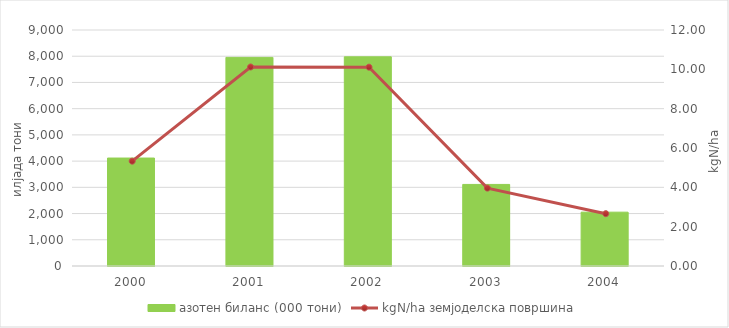
| Category | азотен биланс (000 тони) |
|---|---|
| 2000.0 | 4117 |
| 2001.0 | 7956 |
| 2002.0 | 7978 |
| 2003.0 | 3111 |
| 2004.0 | 2053 |